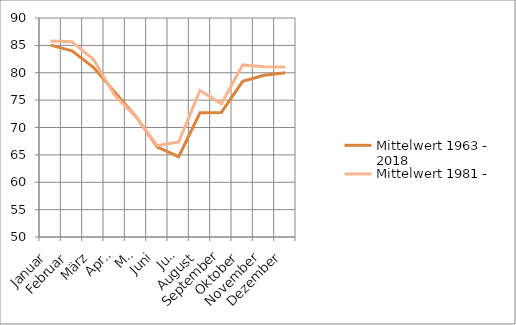
| Category | Mittelwert 1963 - 2018 | Mittelwert 1981 - 2010 |
|---|---|---|
| Januar | 85.037 | 85.8 |
| Februar | 84 | 85.667 |
| März | 81 | 82.467 |
| April | 76.509 | 75.867 |
| Mai | 71.964 | 71.933 |
| Juni | 66.429 | 66.7 |
| Juli | 64.673 | 67.367 |
| August | 72.691 | 76.767 |
| September | 72.75 | 74.333 |
| Oktober | 78.436 | 81.433 |
| November | 79.547 | 81.103 |
| Dezember | 79.981 | 81.067 |